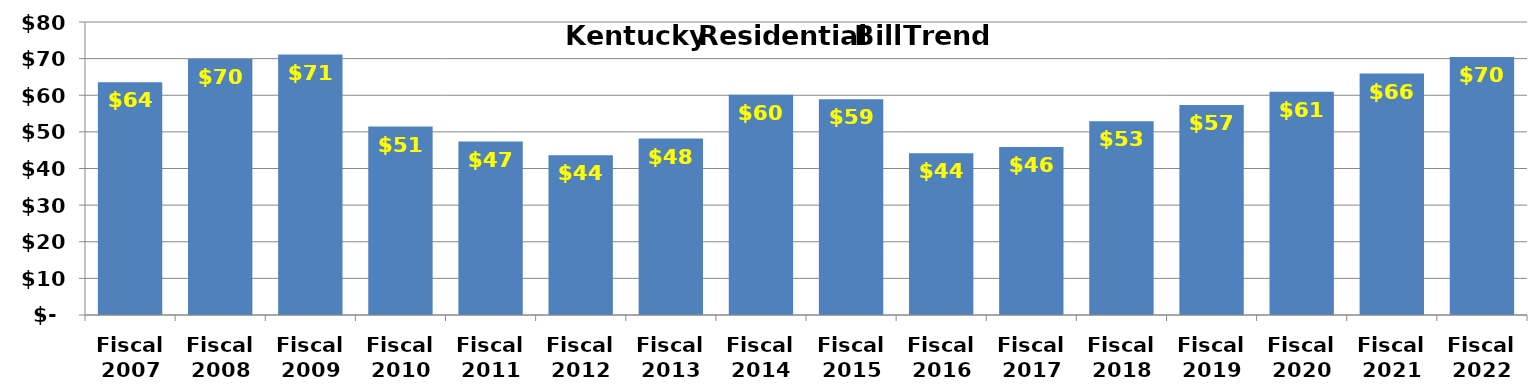
| Category | Monthly Bill |
|---|---|
| Fiscal 2007 | 63.561 |
| Fiscal 2008 | 69.903 |
| Fiscal 2009 | 71.114 |
| Fiscal 2010 | 51.445 |
| Fiscal 2011 | 47.362 |
| Fiscal 2012 | 43.612 |
| Fiscal 2013 | 48.191 |
| Fiscal 2014 | 60.121 |
| Fiscal 2015 | 58.92 |
| Fiscal 2016 | 44.149 |
| Fiscal 2017 | 45.844 |
| Fiscal 2018 | 52.903 |
| Fiscal 2019 | 57.308 |
| Fiscal 2020 | 60.94 |
| Fiscal 2021 | 65.927 |
| Fiscal 2022 | 70.456 |